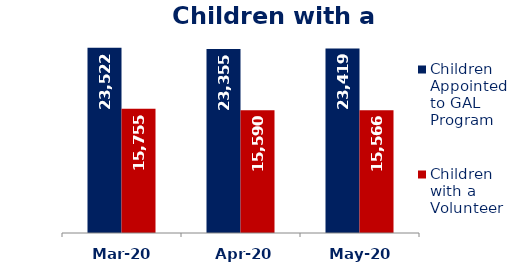
| Category | Children Appointed to GAL Program  | Children with a Volunteer  |
|---|---|---|
| Mar-20 | 23522 | 15755 |
| Apr-20 | 23355 | 15590 |
| May-20 | 23419 | 15566 |